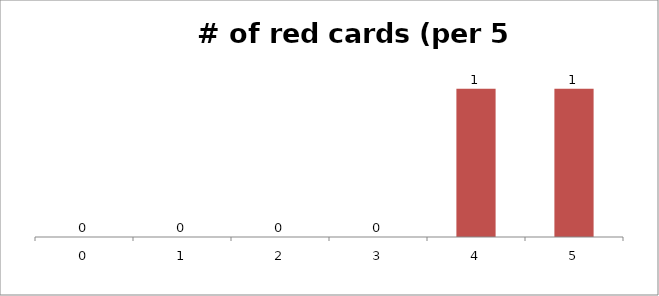
| Category | Cum |
|---|---|
| 0.0 | 0 |
| 1.0 | 0 |
| 2.0 | 0 |
| 3.0 | 0 |
| 4.0 | 1 |
| 5.0 | 1 |